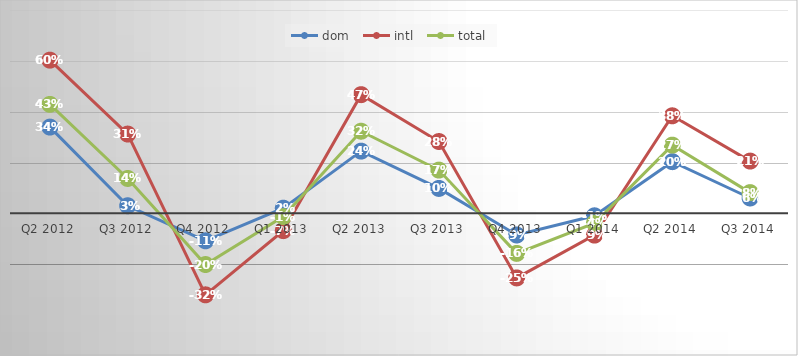
| Category | dom | intl | total |
|---|---|---|---|
| Q2 2012 | 0.339 | 0.603 | 0.429 |
| Q3 2012 | 0.03 | 0.312 | 0.137 |
| Q4 2012 | -0.108 | -0.321 | -0.201 |
| Q1 2013 | 0.02 | -0.068 | -0.013 |
| Q2 2013 | 0.245 | 0.467 | 0.323 |
| Q3 2013 | 0.098 | 0.283 | 0.17 |
| Q4 2013 | -0.085 | -0.254 | -0.158 |
| Q1 2014 | -0.01 | -0.086 | -0.039 |
| Q2 2014 | 0.203 | 0.384 | 0.268 |
| Q3 2014 | 0.06 | 0.206 | 0.082 |